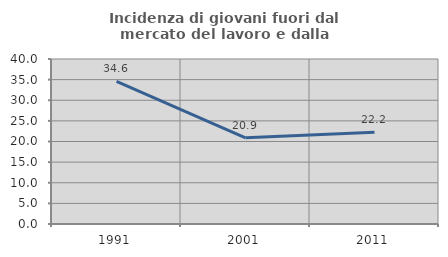
| Category | Incidenza di giovani fuori dal mercato del lavoro e dalla formazione  |
|---|---|
| 1991.0 | 34.562 |
| 2001.0 | 20.882 |
| 2011.0 | 22.222 |